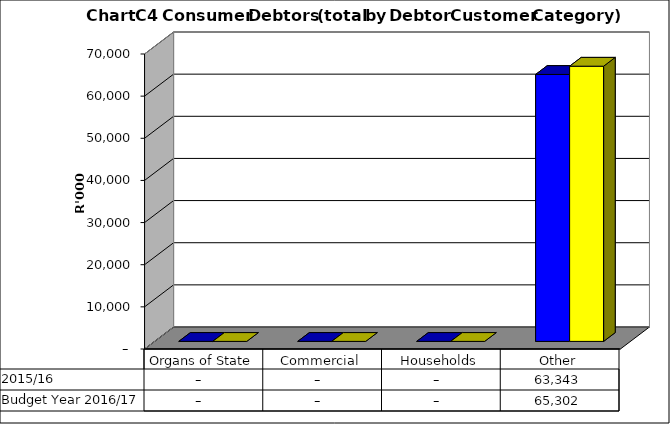
| Category |  2015/16  | Budget Year 2016/17 |
|---|---|---|
| Organs of State | 0 | 0 |
| Commercial | 0 | 0 |
| Households | 0 | 0 |
| Other | 63342552 | 65301600 |